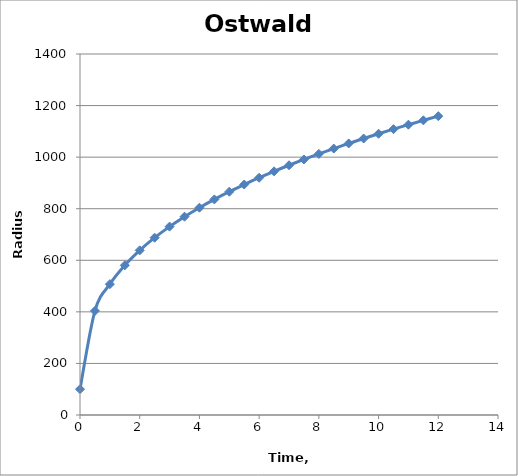
| Category | Series 0 |
|---|---|
| 0.0 | 100 |
| 0.5 | 403.813 |
| 1.0 | 507.465 |
| 1.5 | 580.398 |
| 2.0 | 638.531 |
| 2.5 | 687.654 |
| 3.0 | 730.612 |
| 3.5 | 769.036 |
| 4.0 | 803.962 |
| 4.5 | 836.091 |
| 5.0 | 865.924 |
| 5.5 | 893.831 |
| 6.0 | 920.097 |
| 6.5 | 944.942 |
| 7.0 | 968.546 |
| 7.5 | 991.052 |
| 8.0 | 1012.579 |
| 8.5 | 1033.228 |
| 9.0 | 1053.083 |
| 9.5 | 1072.216 |
| 10.0 | 1090.689 |
| 10.5 | 1108.557 |
| 11.0 | 1125.867 |
| 11.5 | 1142.66 |
| 12.0 | 1158.973 |